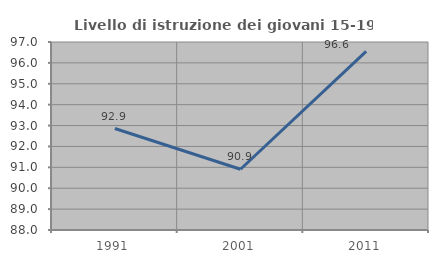
| Category | Livello di istruzione dei giovani 15-19 anni |
|---|---|
| 1991.0 | 92.857 |
| 2001.0 | 90.909 |
| 2011.0 | 96.552 |